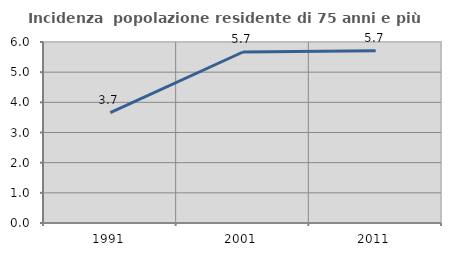
| Category | Incidenza  popolazione residente di 75 anni e più |
|---|---|
| 1991.0 | 3.657 |
| 2001.0 | 5.668 |
| 2011.0 | 5.711 |